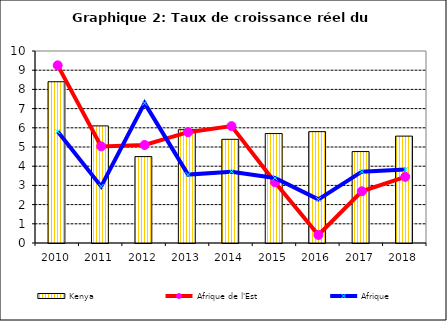
| Category | Kenya |
|---|---|
| 2010.0 | 8.4 |
| 2011.0 | 6.1 |
| 2012.0 | 4.5 |
| 2013.0 | 5.9 |
| 2014.0 | 5.4 |
| 2015.0 | 5.7 |
| 2016.0 | 5.8 |
| 2017.0 | 4.762 |
| 2018.0 | 5.567 |